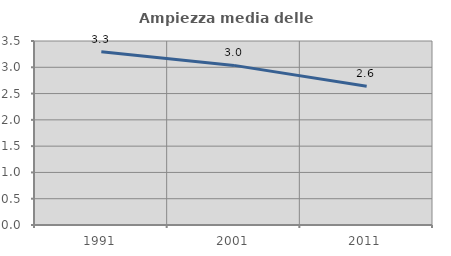
| Category | Ampiezza media delle famiglie |
|---|---|
| 1991.0 | 3.296 |
| 2001.0 | 3.036 |
| 2011.0 | 2.64 |